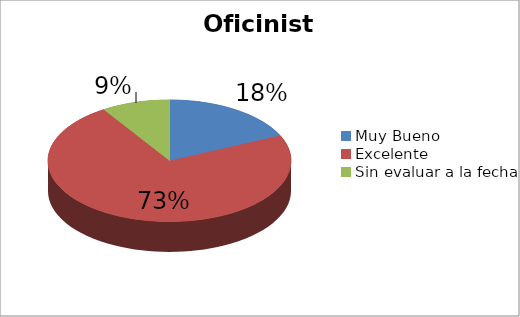
| Category | Cantidad |
|---|---|
| Muy Bueno | 2 |
| Excelente | 8 |
| Sin evaluar a la fecha | 1 |